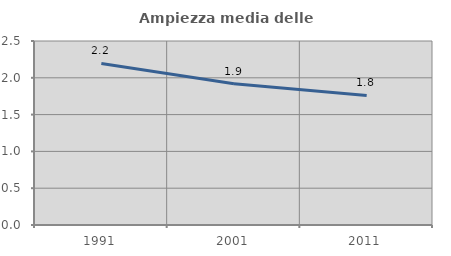
| Category | Ampiezza media delle famiglie |
|---|---|
| 1991.0 | 2.196 |
| 2001.0 | 1.92 |
| 2011.0 | 1.761 |